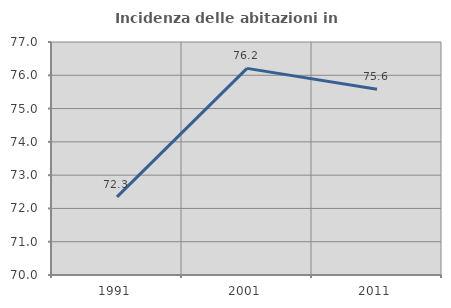
| Category | Incidenza delle abitazioni in proprietà  |
|---|---|
| 1991.0 | 72.348 |
| 2001.0 | 76.208 |
| 2011.0 | 75.579 |